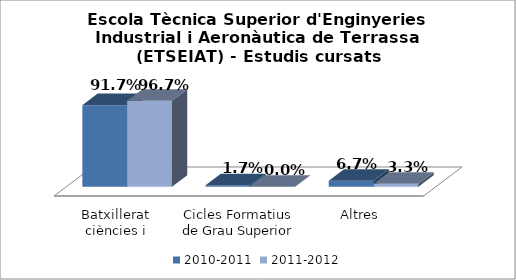
| Category | 2010-2011 | 2011-2012 |
|---|---|---|
| Batxillerat ciències i tecnologia | 0.917 | 0.967 |
| Cicles Formatius de Grau Superior | 0.017 | 0 |
| Altres | 0.067 | 0.033 |